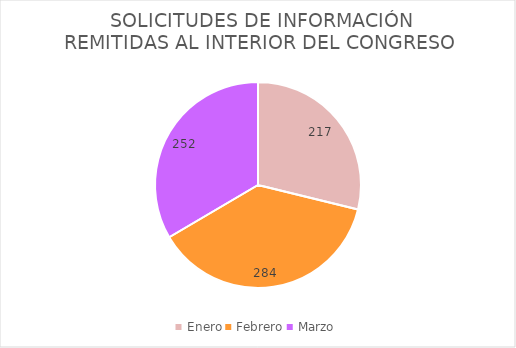
| Category | SOLICITUDES DE INFORMACIÓN REMITIDAS AL INTERIOR DEL CONGRESO  |
|---|---|
| Enero | 217 |
| Febrero | 284 |
| Marzo | 252 |